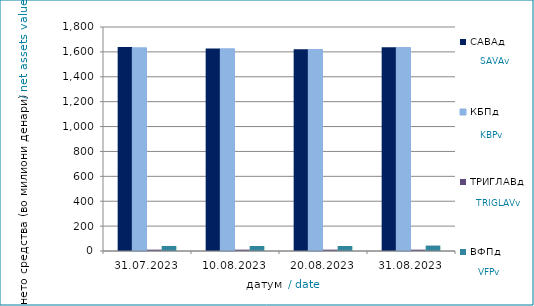
| Category | САВАд | КБПд | ТРИГЛАВд | ВФПд |
|---|---|---|---|---|
| 2023-07-31 | 1638.462 | 1632.598 | 11.06 | 40.517 |
| 2023-08-10 | 1627.2 | 1624.383 | 11.047 | 40.42 |
| 2023-08-20 | 1622.066 | 1619.141 | 11.06 | 40.248 |
| 2023-08-31 | 1638.194 | 1634.476 | 10.864 | 43.599 |